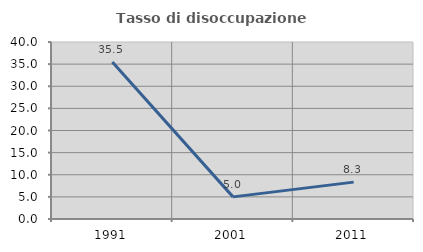
| Category | Tasso di disoccupazione giovanile  |
|---|---|
| 1991.0 | 35.484 |
| 2001.0 | 5 |
| 2011.0 | 8.333 |